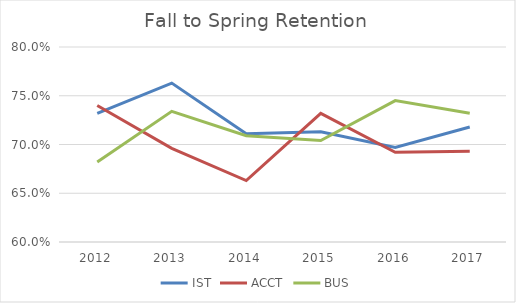
| Category | IST | ACCT | BUS |
|---|---|---|---|
| 2012.0 | 0.732 | 0.74 | 0.682 |
| 2013.0 | 0.763 | 0.696 | 0.734 |
| 2014.0 | 0.711 | 0.663 | 0.709 |
| 2015.0 | 0.713 | 0.732 | 0.704 |
| 2016.0 | 0.697 | 0.692 | 0.745 |
| 2017.0 | 0.718 | 0.693 | 0.732 |